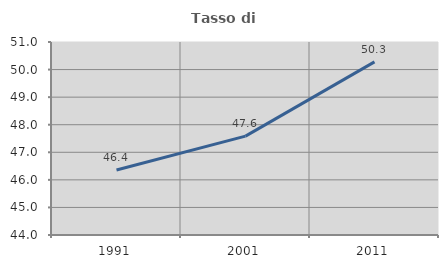
| Category | Tasso di occupazione   |
|---|---|
| 1991.0 | 46.36 |
| 2001.0 | 47.586 |
| 2011.0 | 50.28 |